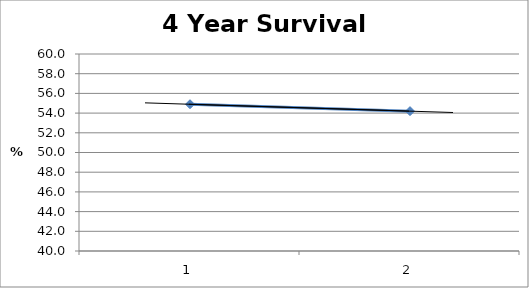
| Category | Series 0 |
|---|---|
| 0 | 54.9 |
| 1 | 54.2 |